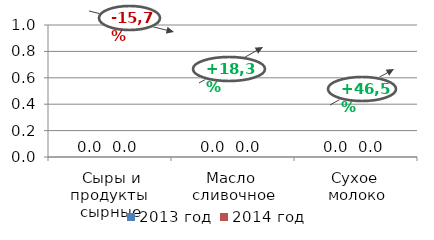
| Category | 2013 год | 2014 год |
|---|---|---|
| Сыры и продукты 
сырные | 0 | 0 |
| Масло 
сливочное | 0 | 0 |
| Сухое 
молоко | 0 | 0 |